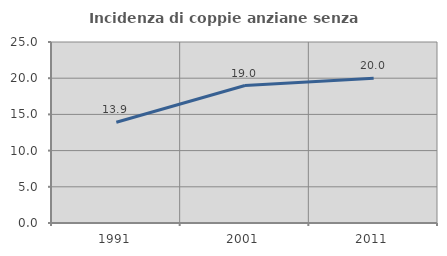
| Category | Incidenza di coppie anziane senza figli  |
|---|---|
| 1991.0 | 13.919 |
| 2001.0 | 18.985 |
| 2011.0 | 20 |